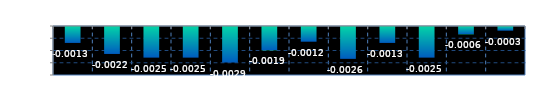
| Category | Series 0 |
|---|---|
| 0 | -0.001 |
| 1 | -0.002 |
| 2 | -0.002 |
| 3 | -0.002 |
| 4 | -0.003 |
| 5 | -0.002 |
| 6 | -0.001 |
| 7 | -0.003 |
| 8 | -0.001 |
| 9 | -0.002 |
| 10 | -0.001 |
| 11 | 0 |